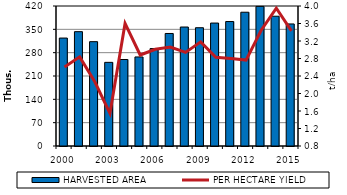
| Category | HARVESTED AREA |
|---|---|
| 2000.0 | 323842 |
| 2001.0 | 343004 |
| 2002.0 | 313025 |
| 2003.0 | 250959 |
| 2004.0 | 259460 |
| 2005.0 | 267160 |
| 2006.0 | 292247 |
| 2007.0 | 337571 |
| 2008.0 | 356924 |
| 2009.0 | 354826 |
| 2010.0 | 368824 |
| 2011.0 | 373386 |
| 2012.0 | 401319.14 |
| 2013.0 | 418808 |
| 2014.0 | 389297.83 |
| 2015.0 | 366180.29 |